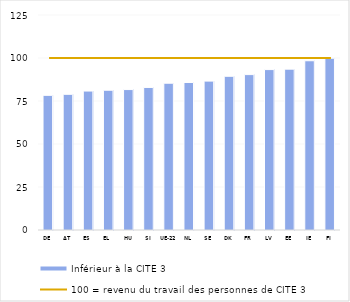
| Category | Inférieur à la CITE 3 |
|---|---|
| DE | 78.284 |
| AT | 78.882 |
| ES | 80.783 |
| EL | 81.262 |
| HU | 81.648 |
| SI | 82.878 |
| UE-22 | 85.341 |
| NL | 85.759 |
| SE | 86.562 |
| DK | 89.369 |
| FR | 90.35 |
| LV | 93.263 |
| EE | 93.521 |
| IE | 98.401 |
| FI | 99.871 |